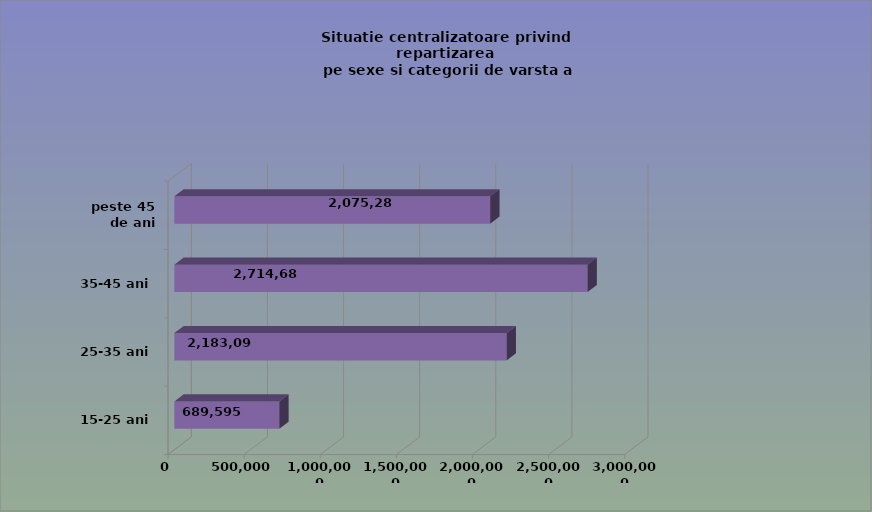
| Category | 15-25 ani 25-35 ani 35-45 ani peste 45 de ani |
|---|---|
| 15-25 ani | 689595 |
| 25-35 ani | 2183097 |
| 35-45 ani | 2714684 |
| peste 45 de ani | 2075283 |